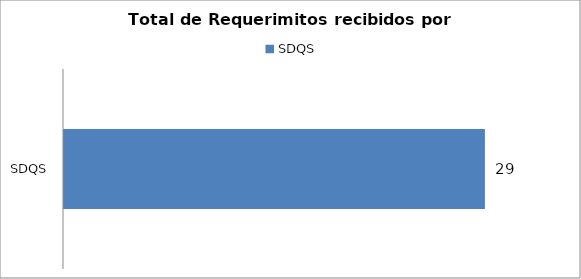
| Category | Total |
|---|---|
| SDQS | 29 |